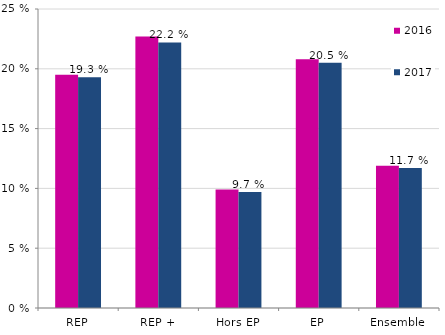
| Category | 2016 | 2017 |
|---|---|---|
| REP | 0.195 | 0.193 |
| REP + | 0.227 | 0.222 |
| Hors EP | 0.099 | 0.097 |
| EP | 0.208 | 0.205 |
| Ensemble | 0.119 | 0.117 |